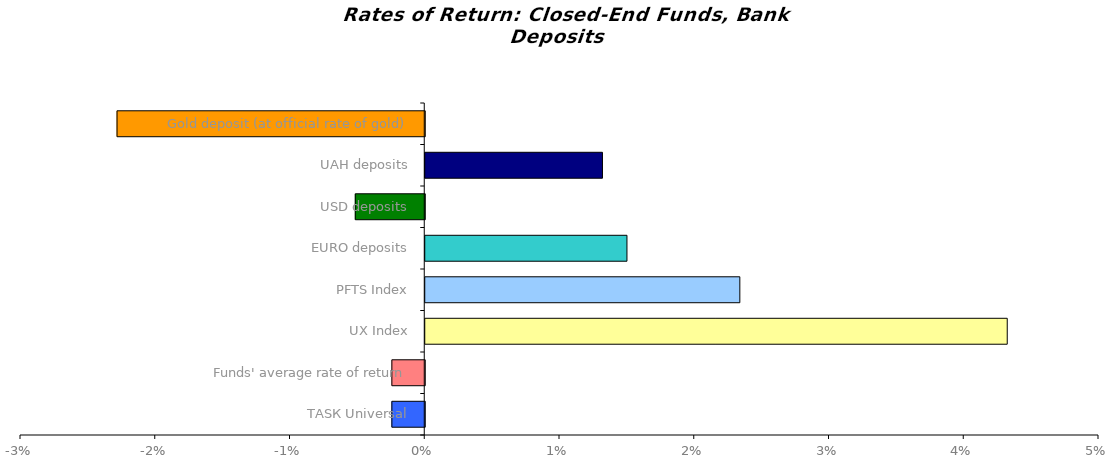
| Category | Series 0 |
|---|---|
| ТАSК Universal | -0.002 |
| Funds' average rate of return | -0.002 |
| UX Index | 0.043 |
| PFTS Index | 0.023 |
| EURO deposits | 0.015 |
| USD deposits | -0.005 |
| UAH deposits | 0.013 |
| Gold deposit (at official rate of gold) | -0.023 |